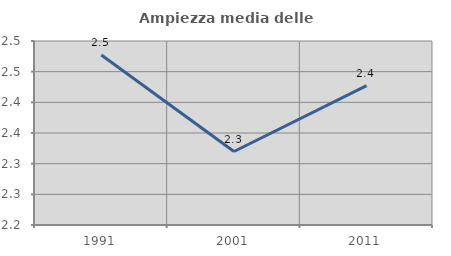
| Category | Ampiezza media delle famiglie |
|---|---|
| 1991.0 | 2.477 |
| 2001.0 | 2.32 |
| 2011.0 | 2.427 |